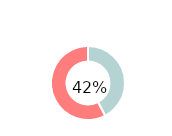
| Category | Series 0 |
|---|---|
| Actual  | 0.423 |
| Budget  | 0.577 |